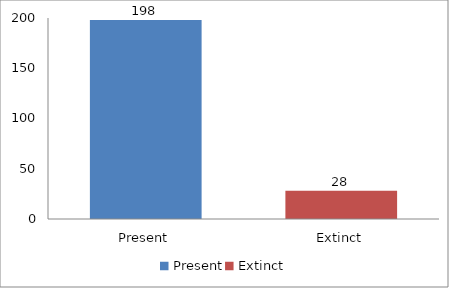
| Category | Series 0 |
|---|---|
| Present | 198 |
| Extinct | 28 |